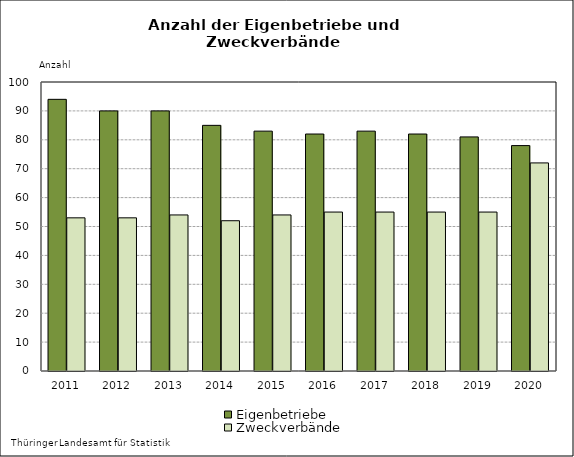
| Category | Eigenbetriebe | Zweckverbände |
|---|---|---|
| 2011.0 | 94 | 53 |
| 2012.0 | 90 | 53 |
| 2013.0 | 90 | 54 |
| 2014.0 | 85 | 52 |
| 2015.0 | 83 | 54 |
| 2016.0 | 82 | 55 |
| 2017.0 | 83 | 55 |
| 2018.0 | 82 | 55 |
| 2019.0 | 81 | 55 |
| 2020.0 | 78 | 72 |